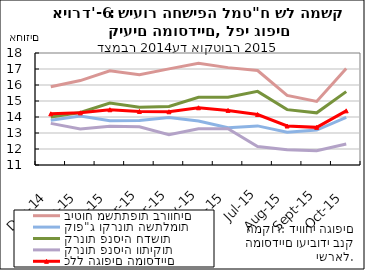
| Category | ביטוח משתתפות ברווחים | קופ"ג וקרנות השתלמות | קרנות פנסיה חדשות | קרנות פנסיה וותיקות | כלל הגופים המוסדיים |
|---|---|---|---|---|---|
| 2014-12-31 | 15.888 | 13.8 | 14 | 13.6 | 14.2 |
| 2015-01-31 | 16.278 | 14.061 | 14.286 | 13.252 | 14.259 |
| 2015-02-28 | 16.891 | 13.769 | 14.867 | 13.427 | 14.453 |
| 2015-03-31 | 16.641 | 13.779 | 14.61 | 13.383 | 14.348 |
| 2015-04-30 | 17.007 | 13.964 | 14.66 | 12.899 | 14.327 |
| 2015-05-31 | 17.361 | 13.751 | 15.236 | 13.267 | 14.577 |
| 2015-06-30 | 17.086 | 13.329 | 15.23 | 13.267 | 14.411 |
| 2015-07-31 | 16.904 | 13.445 | 15.6 | 12.157 | 14.153 |
| 2015-08-31 | 15.352 | 13.054 | 14.461 | 11.95 | 13.436 |
| 2015-09-30 | 14.976 | 13.187 | 14.261 | 11.897 | 13.352 |
| 2015-10-31 | 17.034 | 13.975 | 15.585 | 12.311 | 14.385 |